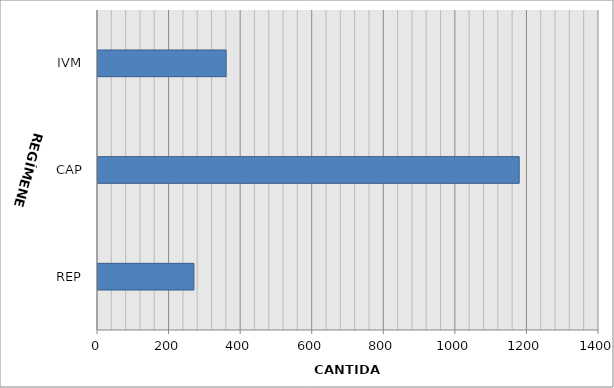
| Category | Series 0 |
|---|---|
| REP | 268 |
| CAP | 1177 |
| IVM | 358 |